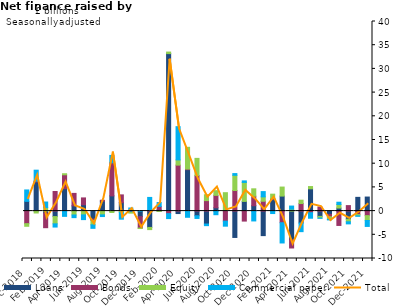
| Category | Loans | Bonds | Equity | Commercial paper |
|---|---|---|---|---|
| Dec-2018 | 2.055 | -2.65 | -0.553 | 2.407 |
| Jan-2019 | 6.159 | 0.161 | -0.399 | 2.312 |
| Feb-2019 | -0.416 | -3.084 | 0.736 | 1.181 |
| Mar-2019 | -1.157 | 4.131 | -1.527 | -0.683 |
| Apr-2019 | 4.742 | 2.92 | 0.22 | -1.109 |
| May-2019 | 1.113 | 2.622 | -0.819 | -0.561 |
| Jun-2019 | 1.344 | 1.437 | -0.795 | -1.001 |
| Jul-2019 | -1.679 | -0.281 | -0.934 | -0.742 |
| Aug-2019 | 2.113 | 0.174 | -0.794 | -0.357 |
| Sep-2019 | 3.215 | 6.981 | -0.291 | 1.548 |
| Oct-2019 | 1.769 | 1.651 | -0.288 | -1.416 |
| Nov-2019 | -0.084 | -0.195 | -0.148 | 0.654 |
| Dec-2019 | -1.17 | -2.415 | -0.093 | 0.031 |
| Jan-2020 | -3.448 | 0.155 | -0.459 | 2.731 |
| Feb-2020 | 0.225 | 0.764 | -0.061 | 0.826 |
| Mar-2020 | 33.225 | -0.54 | 0.327 | -1.041 |
| Apr-2020 | -0.518 | 9.698 | 1.103 | 7.014 |
| May-2020 | 8.738 | 0.131 | 4.592 | -1.303 |
| Jun-2020 | -0.985 | 7.494 | 3.63 | -0.564 |
| Jul-2020 | -2.728 | 2.212 | 1.24 | -0.34 |
| Aug-2020 | 0.706 | 2.614 | 0.992 | -0.762 |
| Sep-2020 | 0.147 | -2.122 | 3.737 | -1.058 |
| Oct-2020 | -5.558 | 4.349 | 3.199 | 0.366 |
| Nov-2020 | 2.042 | -2.106 | 4.004 | 0.327 |
| Dec-2020 | 1.133 | 2.015 | 1.553 | -2.076 |
| Jan-2021 | -5.173 | 2.081 | 0.923 | 1.11 |
| Feb-2021 | 2.428 | 0.193 | 0.952 | -0.517 |
| Mar-2021 | 3.171 | -2.452 | 1.9 | -4.272 |
| Apr-2021 | -6.027 | -1.754 | 0.414 | 0.65 |
| May-2021 | -2.518 | 1.596 | 0.708 | -1.817 |
| Jun-2021 | 4.701 | -0.338 | 0.476 | -1.166 |
| Jul-2021 | -1.117 | 0.867 | -0.335 | -0.072 |
| Aug-2021 | -0.7 | -0.499 | -0.519 | -0.136 |
| Sep-2021 | 0.648 | -3.026 | 0.743 | 0.481 |
| Oct-2021 | -1.714 | 1.158 | -0.538 | -0.446 |
| Nov-2021 | 2.9 | -0.729 | -0.264 | -0.107 |
| Dec-2021 | 2.964 | -0.957 | -1.027 | -1.25 |